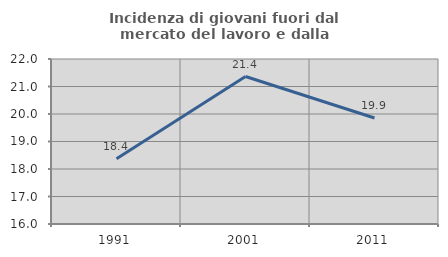
| Category | Incidenza di giovani fuori dal mercato del lavoro e dalla formazione  |
|---|---|
| 1991.0 | 18.372 |
| 2001.0 | 21.362 |
| 2011.0 | 19.856 |